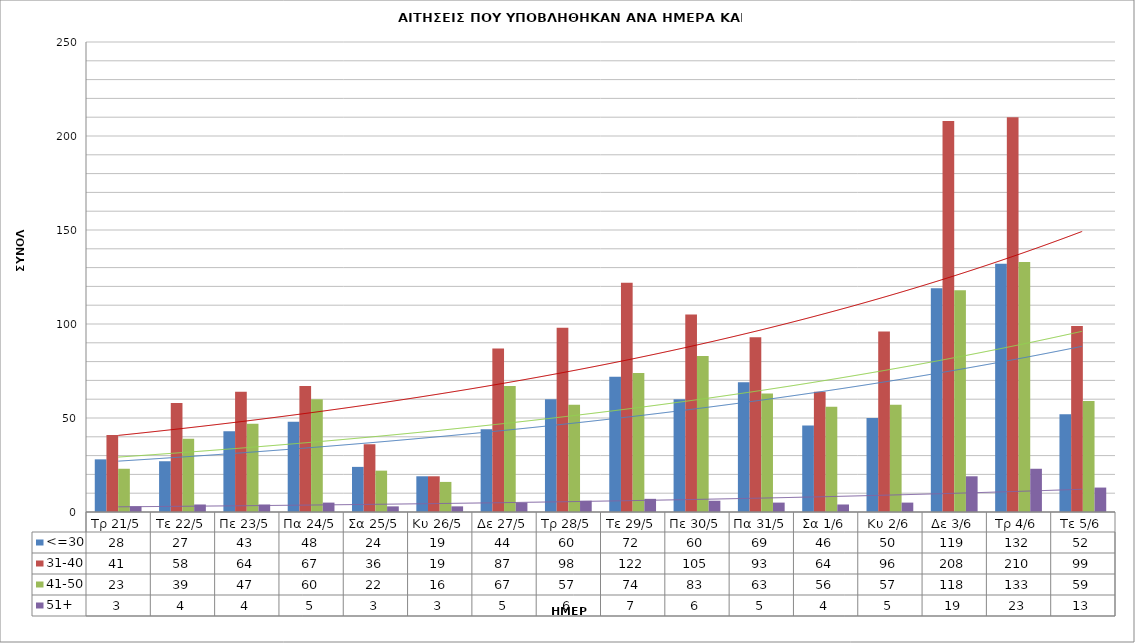
| Category | <=30 | 31-40 | 41-50 | 51+ |
|---|---|---|---|---|
| Τρ 21/5 | 28 | 41 | 23 | 3 |
| Τε 22/5 | 27 | 58 | 39 | 4 |
| Πε 23/5 | 43 | 64 | 47 | 4 |
| Πα 24/5 | 48 | 67 | 60 | 5 |
| Σα 25/5 | 24 | 36 | 22 | 3 |
| Κυ 26/5 | 19 | 19 | 16 | 3 |
| Δε 27/5 | 44 | 87 | 67 | 5 |
| Τρ 28/5 | 60 | 98 | 57 | 6 |
| Τε 29/5 | 72 | 122 | 74 | 7 |
| Πε 30/5 | 60 | 105 | 83 | 6 |
| Πα 31/5 | 69 | 93 | 63 | 5 |
| Σα 1/6 | 46 | 64 | 56 | 4 |
| Κυ 2/6 | 50 | 96 | 57 | 5 |
| Δε 3/6 | 119 | 208 | 118 | 19 |
| Τρ 4/6 | 132 | 210 | 133 | 23 |
| Τε 5/6 | 52 | 99 | 59 | 13 |